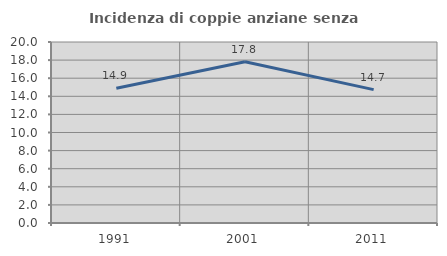
| Category | Incidenza di coppie anziane senza figli  |
|---|---|
| 1991.0 | 14.884 |
| 2001.0 | 17.808 |
| 2011.0 | 14.737 |